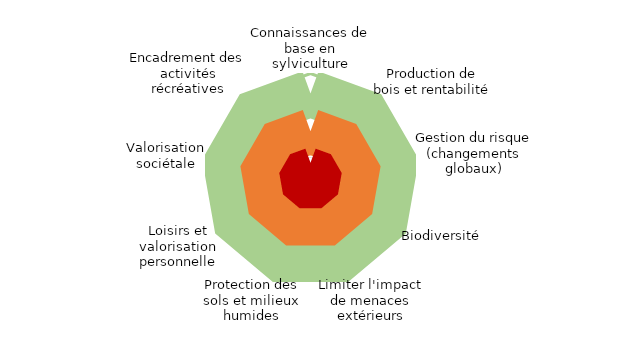
| Category | Series 0 | Series 1 | Series 2 | Series 3 | Connaissances de base en sylviculture |
|---|---|---|---|---|---|
| Connaissances de base en sylviculture | 1 | 0.81 | 0.45 | 0.15 | 0 |
| Production de bois et rentabilité | 1 | 0.81 | 0.45 | 0.15 | 0 |
| Gestion du risque (changements globaux) | 1 | 0.81 | 0.45 | 0.15 | 0 |
| Biodiversité | 1 | 0.81 | 0.45 | 0.15 | 0 |
| Limiter l'impact de menaces extérieurs | 1 | 0.81 | 0.45 | 0.15 | 0 |
| Protection des sols et milieux humides | 1 | 0.81 | 0.45 | 0.15 | 0 |
| Loisirs et valorisation personnelle | 1 | 0.81 | 0.45 | 0.15 | 0 |
| Valorisation sociétale | 1 | 0.81 | 0.45 | 0.15 | 0 |
| Encadrement des activités récréatives | 1 | 0.81 | 0.45 | 0.15 | 0 |